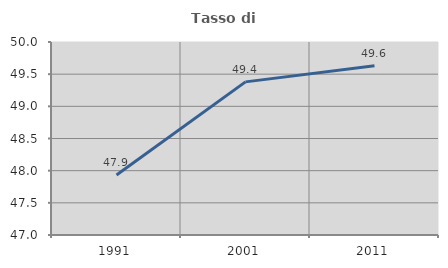
| Category | Tasso di occupazione   |
|---|---|
| 1991.0 | 47.933 |
| 2001.0 | 49.38 |
| 2011.0 | 49.633 |